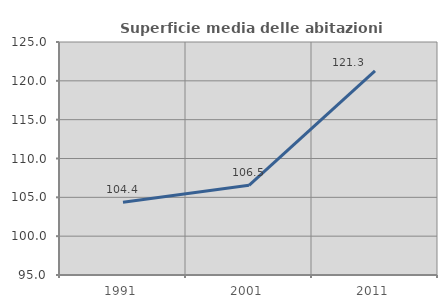
| Category | Superficie media delle abitazioni occupate |
|---|---|
| 1991.0 | 104.371 |
| 2001.0 | 106.545 |
| 2011.0 | 121.276 |